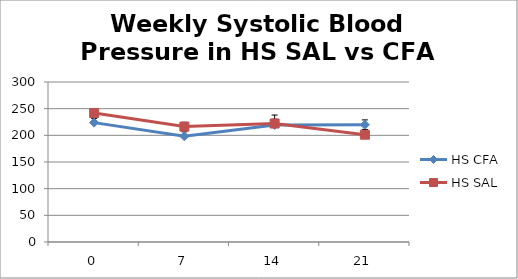
| Category | HS CFA | HS SAL |
|---|---|---|
| 0.0 | 223.832 | 241.861 |
| 7.0 | 198.155 | 216.395 |
| 14.0 | 219.541 | 222.104 |
| 21.0 | 219.704 | 201.161 |